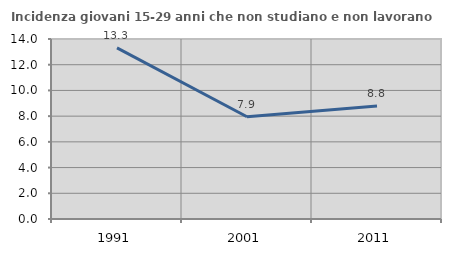
| Category | Incidenza giovani 15-29 anni che non studiano e non lavorano  |
|---|---|
| 1991.0 | 13.313 |
| 2001.0 | 7.95 |
| 2011.0 | 8.791 |